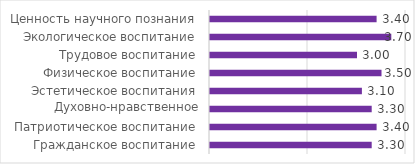
| Category | Средний
 балл |
|---|---|
| Гражданское воспитание | 3.3 |
| Патриотическое воспитание | 3.4 |
| Духовно-нравственное воспитание | 3.3 |
| Эстетическое воспитания | 3.1 |
| Физическое воспитание | 3.5 |
| Трудовое воспитание | 3 |
| Экологическое воспитание | 3.7 |
| Ценность научного познания | 3.4 |